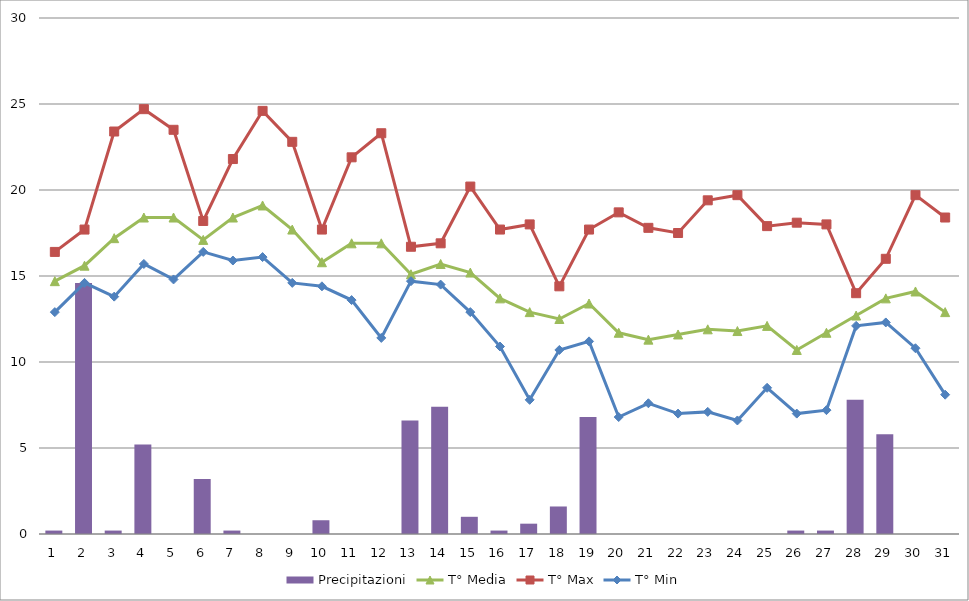
| Category | Precipitazioni |
|---|---|
| 0 | 0.2 |
| 1 | 14.6 |
| 2 | 0.2 |
| 3 | 5.2 |
| 4 | 0 |
| 5 | 3.2 |
| 6 | 0.2 |
| 7 | 0 |
| 8 | 0 |
| 9 | 0.8 |
| 10 | 0 |
| 11 | 0 |
| 12 | 6.6 |
| 13 | 7.4 |
| 14 | 1 |
| 15 | 0.2 |
| 16 | 0.6 |
| 17 | 1.6 |
| 18 | 6.8 |
| 19 | 0 |
| 20 | 0 |
| 21 | 0 |
| 22 | 0 |
| 23 | 0 |
| 24 | 0 |
| 25 | 0.2 |
| 26 | 0.2 |
| 27 | 7.8 |
| 28 | 5.8 |
| 29 | 0 |
| 30 | 0 |